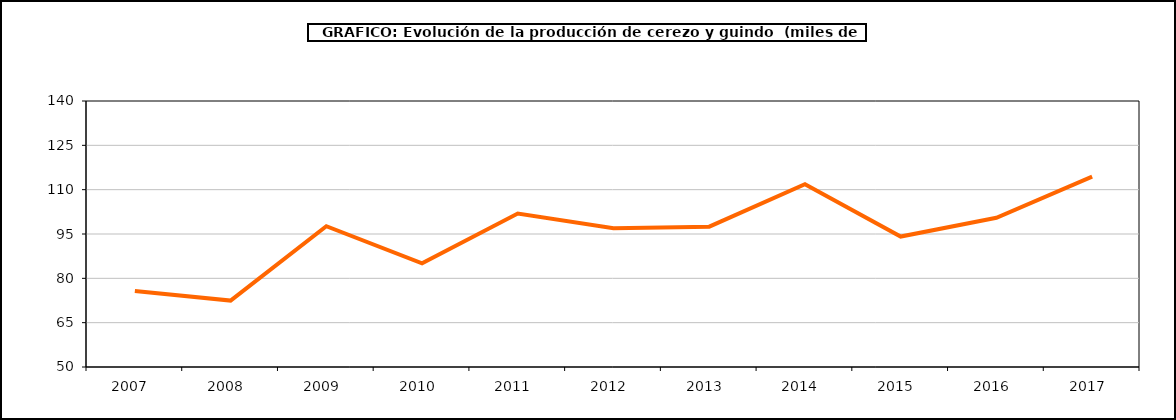
| Category | producción cerezo y guindo |
|---|---|
| 2007.0 | 75.738 |
| 2008.0 | 72.468 |
| 2009.0 | 97.645 |
| 2010.0 | 85.078 |
| 2011.0 | 101.945 |
| 2012.0 | 96.946 |
| 2013.0 | 97.489 |
| 2014.0 | 111.821 |
| 2015.0 | 94.143 |
| 2016.0 | 100.503 |
| 2017.0 | 114.433 |